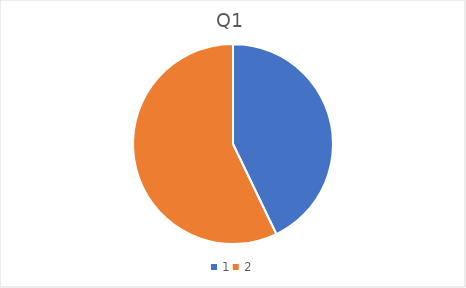
| Category | Series 0 |
|---|---|
| 0 | 3 |
| 1 | 4 |